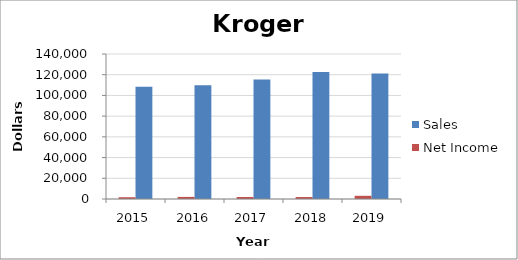
| Category | Sales | Net Income |
|---|---|---|
| 2019.0 | 121162 | 3076 |
| 2018.0 | 122662 | 1890 |
| 2017.0 | 115337 | 1959 |
| 2016.0 | 109830 | 2021 |
| 2015.0 | 108465 | 1711 |